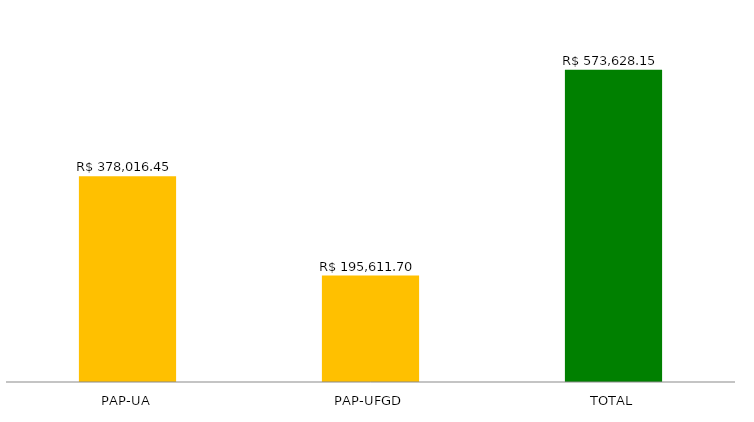
| Category | Series 0 |
|---|---|
| PAP-UA | 378016.45 |
| PAP-UFGD | 195611.7 |
| TOTAL | 573628.15 |